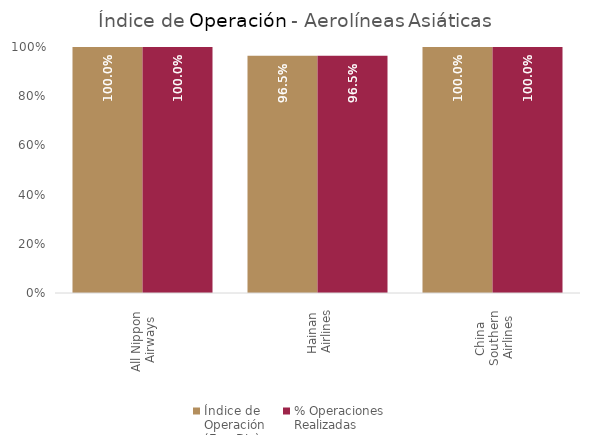
| Category | Índice de 
Operación
(Ene-Dic) | % Operaciones
Realizadas |
|---|---|---|
| All Nippon 
Airways | 1 | 1 |
| Hainan 
Airlines | 0.965 | 0.965 |
| China 
Southern 
Airlines | 1 | 1 |